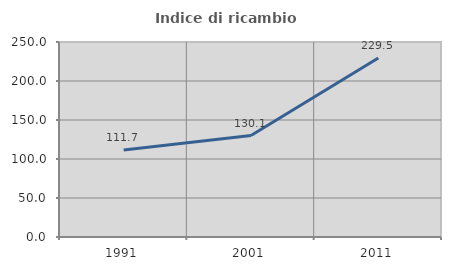
| Category | Indice di ricambio occupazionale  |
|---|---|
| 1991.0 | 111.679 |
| 2001.0 | 130.079 |
| 2011.0 | 229.534 |